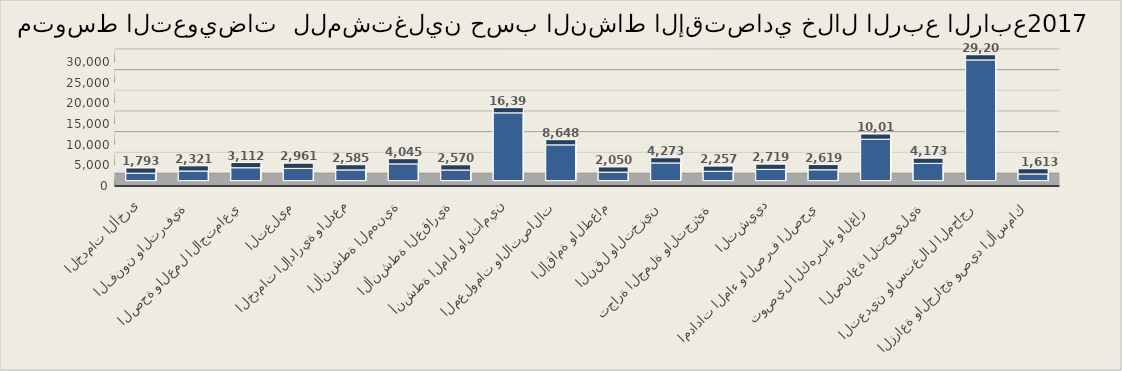
| Category | متوسط التعويضات  |
|---|---|
| الزراعة والحراجة وصيد الأسماك | 1612.742 |
| التعدين واستغلال المحاجر | 29199.655 |
| الصناعة التحويلية | 4172.951 |
| توصيل الكهرباء والغاز  | 10015.417 |
| امدادات الماء والصرف الصحي | 2619.422 |
| التشييد | 2719.451 |
| تجارة الجملة والتجزئة | 2257.303 |
| النقل والتخزين | 4272.968 |
| الإقامة والطعام | 2049.549 |
| المعلومات والاتصالات | 8648.103 |
| أنشطة المال والتأمين | 16394.913 |
| الأنشطة العقارية | 2569.773 |
| الأنشطة المهنية  | 4044.608 |
| الخدمات الإدارية والدعم | 2584.889 |
| التعليم | 2961.428 |
| الصحة والعمل الاجتماعي | 3111.791 |
| الفنون والترفية | 2320.771 |
| الخدمات الأخرى | 1793.431 |